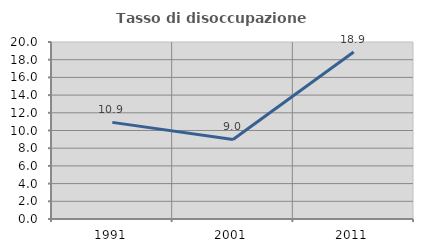
| Category | Tasso di disoccupazione giovanile  |
|---|---|
| 1991.0 | 10.918 |
| 2001.0 | 8.984 |
| 2011.0 | 18.878 |